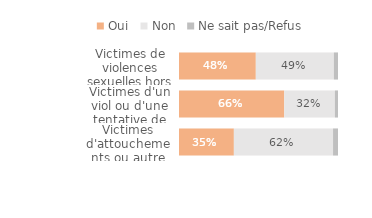
| Category | Oui | Non | Ne sait pas/Refus |
|---|---|---|---|
| Victimes d'attouchements ou autre agression sexuelle | 0.345 | 0.624 | 0.031 |
| Victimes d'un viol ou d'une tentative de viol  | 0.662 | 0.318 | 0.019 |
| Victimes de violences sexuelles hors ménage | 0.483 | 0.491 | 0.026 |